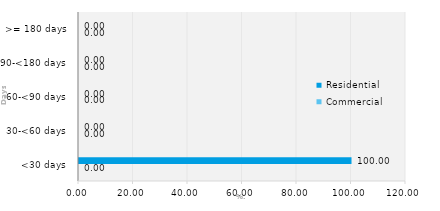
| Category | Commercial | Residential |
|---|---|---|
| <30 days | 0 | 100 |
| 30-<60 days | 0 | 0 |
| 60-<90 days | 0 | 0 |
| 90-<180 days | 0 | 0 |
| >= 180 days | 0 | 0 |